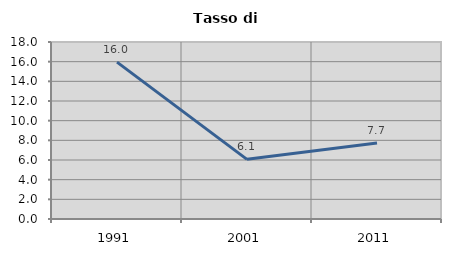
| Category | Tasso di disoccupazione   |
|---|---|
| 1991.0 | 15.957 |
| 2001.0 | 6.068 |
| 2011.0 | 7.728 |